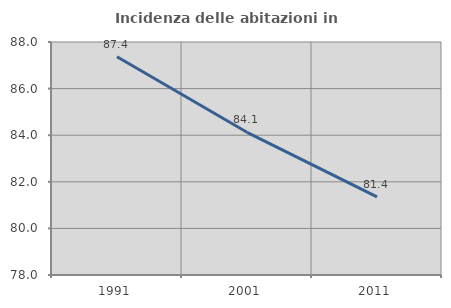
| Category | Incidenza delle abitazioni in proprietà  |
|---|---|
| 1991.0 | 87.368 |
| 2001.0 | 84.125 |
| 2011.0 | 81.356 |